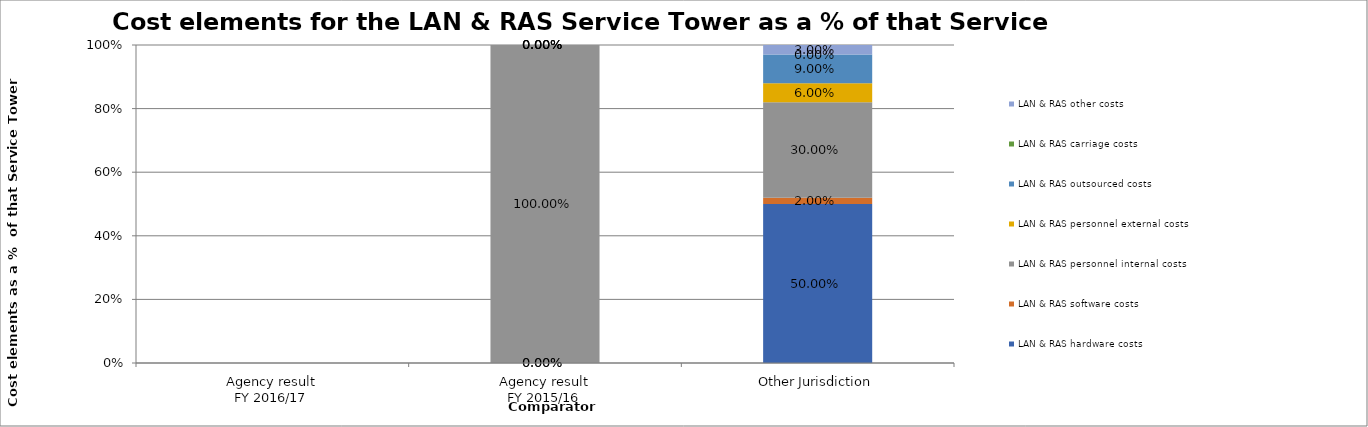
| Category | LAN & RAS hardware costs | LAN & RAS software costs | LAN & RAS personnel internal costs | LAN & RAS personnel external costs | LAN & RAS outsourced costs | LAN & RAS carriage costs | LAN & RAS other costs |
|---|---|---|---|---|---|---|---|
| Agency result
FY 2016/17 | 0 | 0 | 0 | 0 | 0 | 0 | 0 |
| Agency result
FY 2015/16 | 0 | 0 | 1 | 0 | 0 | 0 | 0 |
| Other Jurisdiction | 0.5 | 0.02 | 0.3 | 0.06 | 0.09 | 0 | 0.03 |